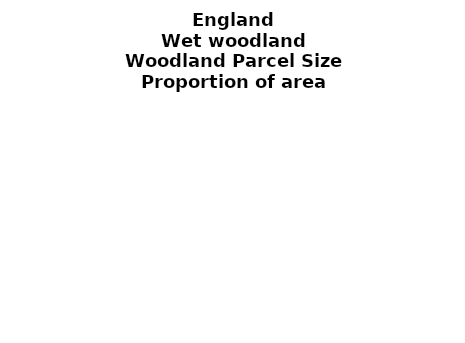
| Category | Wet woodland |
|---|---|
| <5 ha | 0.348 |
| ≥5 and <10 ha | 0.119 |
| ≥10 and <15 ha | 0.086 |
| ≥15 and <20 ha | 0.058 |
| ≥20 and <25 ha | 0.033 |
| ≥25 and <30 ha | 0.05 |
| ≥30 and <35 ha | 0.029 |
| ≥35 and <40 ha | 0.014 |
| ≥40 and <45 ha | 0.018 |
| ≥45 and <50 ha | 0.025 |
| ≥50 and <60 ha | 0.028 |
| ≥60 and <70 ha | 0.029 |
| ≥70 and <80 ha | 0.019 |
| ≥80 and <90 ha | 0.014 |
| ≥90 and <100 ha | 0.009 |
| ≥100 and <150 ha | 0.024 |
| ≥150 and <200 ha | 0.035 |
| ≥200 ha | 0.06 |